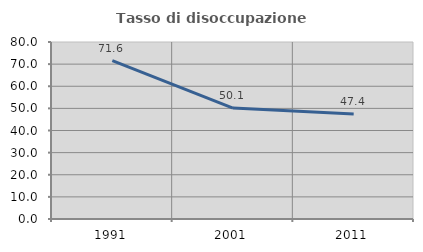
| Category | Tasso di disoccupazione giovanile  |
|---|---|
| 1991.0 | 71.597 |
| 2001.0 | 50.128 |
| 2011.0 | 47.407 |